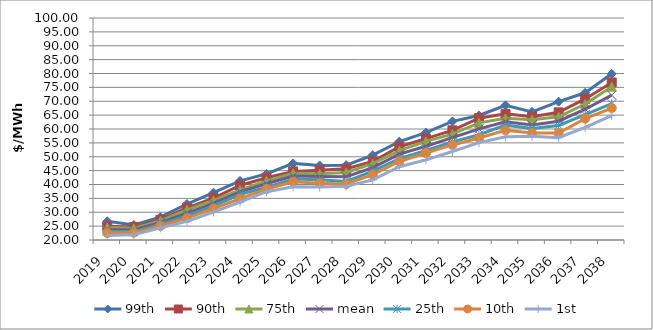
| Category | 99th | 90th | 75th | mean | 25th | 10th | 1st |
|---|---|---|---|---|---|---|---|
| 2019.0 | 26.739 | 24.911 | 24.493 | 23.813 | 23.116 | 22.5 | 21.643 |
| 2020.0 | 25.406 | 24.663 | 24.266 | 23.625 | 22.972 | 22.661 | 21.933 |
| 2021.0 | 28.218 | 27.24 | 26.849 | 26.291 | 25.734 | 25.07 | 24.379 |
| 2022.0 | 32.974 | 31.573 | 30.865 | 29.66 | 28.644 | 27.873 | 26.717 |
| 2023.0 | 37.038 | 35.092 | 34.244 | 33.218 | 32.256 | 31.316 | 30.089 |
| 2024.0 | 41.317 | 39.659 | 38.009 | 37.35 | 36.478 | 34.854 | 33.649 |
| 2025.0 | 43.803 | 42.423 | 41.279 | 40.284 | 38.979 | 38.392 | 37.413 |
| 2026.0 | 47.608 | 44.73 | 44.04 | 43.039 | 41.964 | 40.981 | 39.154 |
| 2027.0 | 46.869 | 45.138 | 43.84 | 42.856 | 41.678 | 40.453 | 39.128 |
| 2028.0 | 46.968 | 45.685 | 44.353 | 42.826 | 41.118 | 40.171 | 39.406 |
| 2029.0 | 50.597 | 48.306 | 47.491 | 46.066 | 44.833 | 43.538 | 41.667 |
| 2030.0 | 55.438 | 53.605 | 52.216 | 50.933 | 49.318 | 48.293 | 46.405 |
| 2031.0 | 58.714 | 56.52 | 55.547 | 53.786 | 52.317 | 51.335 | 48.875 |
| 2032.0 | 62.74 | 59.514 | 58.157 | 56.901 | 55.374 | 54.257 | 51.907 |
| 2033.0 | 64.884 | 63.9 | 62.218 | 60.054 | 57.919 | 56.736 | 55.09 |
| 2034.0 | 68.544 | 65.457 | 63.856 | 62.57 | 61.386 | 59.545 | 57.213 |
| 2035.0 | 66.163 | 64.383 | 63.325 | 61.487 | 60.161 | 58.529 | 57.359 |
| 2036.0 | 69.851 | 66.001 | 64.384 | 62.815 | 61.277 | 58.525 | 56.87 |
| 2037.0 | 73.05 | 70.838 | 69.014 | 67.123 | 65.203 | 63.735 | 60.586 |
| 2038.0 | 79.878 | 76.771 | 75.262 | 72.195 | 69.131 | 67.543 | 64.826 |